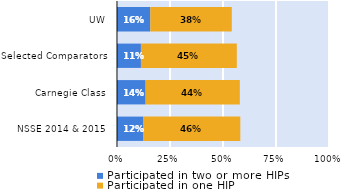
| Category | Participated in two or more HIPs | Participated in one HIP |
|---|---|---|
| NSSE 2014 & 2015 | 0.123 | 0.459 |
| Carnegie Class | 0.135 | 0.444 |
| Selected Comparators | 0.113 | 0.452 |
| UW | 0.157 | 0.384 |